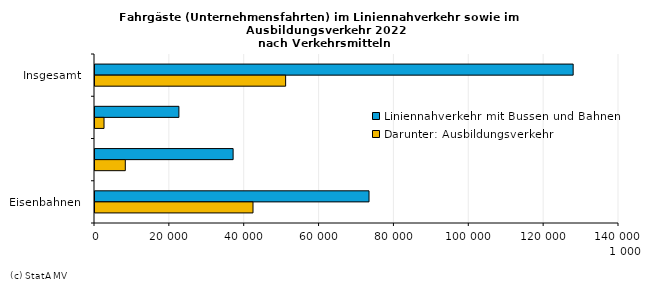
| Category | Liniennahverkehr mit Bussen und Bahnen | Darunter: Ausbildungsverkehr |
|---|---|---|
| Insgesamt | 127753 | 50932 |
| Eisenbahnen | 22416 | 2409 |
| Straßenbahnen | 36901 | 8095 |
| Omnibussen | 73213 | 42214 |